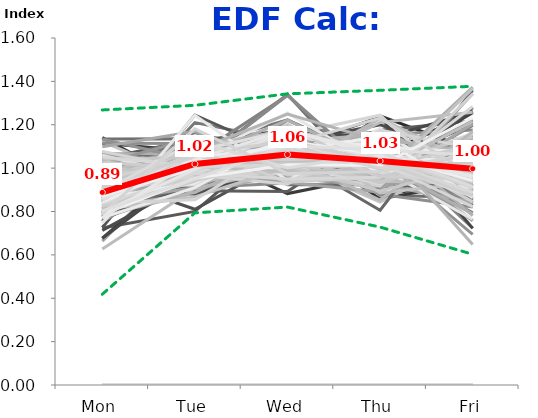
| Category | 12/31/90 | 1/7/91 | 1/14/91 | 1/21/91 | 1/28/91 | 2/4/91 | 2/11/91 | 2/18/91 | 2/25/91 | 3/4/91 | 3/11/91 | 3/18/91 | 3/25/91 | 4/1/91 | 4/8/91 | 4/15/91 | 4/22/91 | 4/29/91 | 5/6/91 | 5/13/91 | 5/20/91 | 5/27/91 | 6/3/91 | 6/10/91 | 6/17/91 | 6/24/91 | 7/1/91 | 7/8/91 | 7/15/91 | 7/22/91 | 7/29/91 | 8/5/91 | 8/12/91 | 8/19/91 | 8/26/91 | 9/2/91 | 9/9/91 | 9/16/91 | 9/23/91 | 9/30/91 | 10/7/91 | 10/14/91 | 10/21/91 | 10/28/91 | 11/4/91 | 11/11/91 | 11/18/91 | 11/25/91 | 12/2/91 | 12/9/91 | 12/16/91 | 12/23/91 | 12/30/91 | 1/6/92 | 1/13/92 | 1/20/92 | 1/27/92 | 2/3/92 | 2/10/92 | 2/17/92 | 2/24/92 | 3/2/92 | 3/9/92 | 3/16/92 | 3/23/92 | 3/30/92 | 4/6/92 | 4/13/92 | 4/20/92 | 4/27/92 | 5/4/92 | 5/11/92 | 5/18/92 | 5/25/92 | 6/1/92 | 6/8/92 | 6/15/92 | 6/22/92 | 6/29/92 | 7/6/92 | 7/13/92 | 7/20/92 | 7/27/92 | 8/3/92 | 8/10/92 | 8/17/92 | 8/24/92 | 8/31/92 | 9/7/92 | 9/14/92 | 9/21/92 | 9/28/92 | 10/5/92 | 10/12/92 | 10/19/92 | 10/26/92 | 11/2/92 | 11/9/92 | 11/16/92 | 11/23/92 | 11/30/92 | 12/7/92 | 12/14/92 | 12/21/92 | 12/28/92 | 1/4/93 | 1/11/93 | 1/18/93 | 1/25/93 | 2/1/93 | 2/8/93 | 2/15/93 | 2/22/93 | 3/1/93 | 3/8/93 | 3/15/93 | 3/22/93 | 3/29/93 | 4/5/93 | 4/12/93 | 4/19/93 | 4/26/93 | 5/3/93 | 5/10/93 | 5/17/93 | 5/24/93 | 5/31/93 | 6/7/93 | 6/14/93 | 6/21/93 | 6/28/93 | 7/5/93 | 7/12/93 | 7/19/93 | 7/26/93 | 8/2/93 | 8/9/93 | 8/16/93 | 8/23/93 | 8/30/93 | 9/6/93 | 9/13/93 | 9/20/93 | 9/27/93 | 10/4/93 | 10/11/93 | 10/18/93 | 10/25/93 | 11/1/93 | 11/8/93 | 11/15/93 | 11/22/93 | 11/29/93 | 12/6/93 | 12/13/93 | 12/20/93 | 12/27/93 | 1/3/94 | 1/10/94 | 1/17/94 | 1/24/94 | 1/31/94 | 2/7/94 | 2/14/94 | 2/21/94 | 2/28/94 | 3/7/94 | 3/14/94 | 3/21/94 | 3/28/94 | 4/4/94 | 4/11/94 | 4/18/94 | 4/25/94 | 5/2/94 | 5/9/94 | 5/16/94 | 5/23/94 | 5/30/94 | 6/6/94 | 6/13/94 | 6/20/94 | 6/27/94 | 7/4/94 | 7/11/94 | 7/18/94 | 7/25/94 | 8/1/94 | 8/8/94 | 8/15/94 | 8/22/94 | 8/29/94 | 9/5/94 | 9/12/94 | 9/19/94 | 9/26/94 | 10/3/94 | 10/10/94 | 10/17/94 | 10/24/94 | 10/31/94 | 11/7/94 | 11/14/94 | 11/21/94 | 11/28/94 | 12/5/94 | 12/12/94 | 12/19/94 | 12/26/94 | 1/2/95 | 1/9/95 | 1/16/95 | 1/23/95 | 1/30/95 | 2/6/95 | 2/13/95 | 2/20/95 | 2/27/95 | 3/6/95 | 3/13/95 | 3/20/95 | 3/27/95 | 4/3/95 | 4/10/95 | 4/17/95 | 4/24/95 | 5/1/95 | 5/8/95 | 5/15/95 | 5/22/95 | 5/29/95 | 6/5/95 | 6/12/95 | 6/19/95 | 6/26/95 | 7/3/95 | 7/10/95 | 7/17/95 | 7/24/95 | 7/31/95 | 8/7/95 | 8/14/95 | 8/21/95 | 8/28/95 | 9/4/95 | 9/11/95 | 9/18/95 | 9/25/95 | 10/2/95 | 10/9/95 | 10/16/95 | Min: | Max: | FINAL: |
|---|---|---|---|---|---|---|---|---|---|---|---|---|---|---|---|---|---|---|---|---|---|---|---|---|---|---|---|---|---|---|---|---|---|---|---|---|---|---|---|---|---|---|---|---|---|---|---|---|---|---|---|---|---|---|---|---|---|---|---|---|---|---|---|---|---|---|---|---|---|---|---|---|---|---|---|---|---|---|---|---|---|---|---|---|---|---|---|---|---|---|---|---|---|---|---|---|---|---|---|---|---|---|---|---|---|---|---|---|---|---|---|---|---|---|---|---|---|---|---|---|---|---|---|---|---|---|---|---|---|---|---|---|---|---|---|---|---|---|---|---|---|---|---|---|---|---|---|---|---|---|---|---|---|---|---|---|---|---|---|---|---|---|---|---|---|---|---|---|---|---|---|---|---|---|---|---|---|---|---|---|---|---|---|---|---|---|---|---|---|---|---|---|---|---|---|---|---|---|---|---|---|---|---|---|---|---|---|---|---|---|---|---|---|---|---|---|---|---|---|---|---|---|---|---|---|---|---|---|---|---|---|---|---|---|---|---|---|---|---|---|---|---|---|---|---|---|---|---|---|---|---|---|---|---|
| Mon | 0 | 0.914 | 0 | 0.757 | 0.724 | 0.966 | 1.115 | 0 | 0.957 | 0.895 | 0.82 | 0.91 | 0 | 0.771 | 0.789 | 0.778 | 1.001 | 0.849 | 0.81 | 0.753 | 0.726 | 0 | 0.992 | 0.828 | 0.83 | 0.852 | 0 | 0.869 | 0.869 | 1.005 | 0.839 | 0.812 | 0.792 | 1.141 | 0.877 | 0 | 0.784 | 0 | 0.907 | 0.913 | 0.9 | 0.663 | 0.874 | 0.858 | 0.88 | 0.677 | 1.134 | 0 | 1.017 | 0.901 | 0 | 0 | 0 | 0.948 | 0.713 | 0.839 | 0.909 | 0.8 | 0.873 | 0 | 0.848 | 0.906 | 0.885 | 0.792 | 0.886 | 0.753 | 0.842 | 0 | 0.903 | 0.891 | 0.958 | 0.842 | 0.87 | 0 | 0.938 | 0.849 | 0.768 | 0.95 | 0 | 0.945 | 0.781 | 0.948 | 0.797 | 0.939 | 0.842 | 0.85 | 0.95 | 0.939 | 0 | 1.122 | 0.811 | 0.878 | 0 | 0.676 | 1.002 | 0.941 | 0.987 | 0.912 | 0.829 | 0 | 0.974 | 1.007 | 0 | 0 | 0 | 0.77 | 0.828 | 0.777 | 1.042 | 0.779 | 1.006 | 0 | 1.115 | 0.926 | 1.04 | 0.792 | 0.956 | 0.792 | 0 | 0.952 | 0.862 | 1.067 | 0.903 | 0.935 | 0.81 | 0.82 | 0 | 0.975 | 0.858 | 0.899 | 0.92 | 0 | 0.793 | 0.869 | 0.878 | 0.989 | 0.93 | 0.848 | 0.859 | 0.843 | 0 | 0.866 | 0.855 | 0.928 | 0.878 | 0.628 | 1.075 | 0.933 | 0.818 | 0.827 | 0.843 | 0 | 0.988 | 1.025 | 0.849 | 0 | 0.848 | 0.822 | 1.052 | 0.774 | 0.938 | 0.965 | 1.133 | 0.88 | 0 | 0.873 | 0.912 | 0 | 0.902 | 0 | 1.098 | 0.887 | 0.83 | 0 | 1.06 | 0.93 | 0.79 | 1.019 | 0 | 1.06 | 0.839 | 0.883 | 0.982 | 0 | 0.826 | 0.876 | 0.88 | 0.953 | 0.843 | 0.79 | 0.816 | 0.94 | 0 | 0.799 | 0.887 | 0.913 | 0.909 | 0.746 | 0.815 | 0.874 | 0.997 | 0.926 | 0.823 | 0 | 0.931 | 0.838 | 0.808 | 0.898 | 0 | 0 | 0.86 | 0.939 | 1.002 | 0.845 | 1.028 | 0.771 | 0 | 0.879 | 0.878 | 0.802 | 0.902 | 0.862 | 0.934 | 0 | 0.915 | 0.956 | 0.839 | 0.838 | 0.906 | 0.854 | 0 | 1.041 | 0.831 | 0.872 | 0.904 | 0 | 1.077 | 0.822 | 0.9 | 0.871 | 0.948 | 0.796 | 1.052 | 0.911 | 0 | 0.787 | 0.892 | 0.772 | 0.888 | 0.788 | 0.803 | 0.418 | 1.268 | 0.888 |
| Tue | 0 | 1.008 | 0 | 0.978 | 0.8 | 1.119 | 1.078 | 0 | 0.81 | 1.126 | 0.896 | 0.986 | 0 | 1.017 | 0.967 | 1.035 | 1.024 | 1.164 | 0.968 | 1.21 | 1.245 | 0 | 1.028 | 1.047 | 0.964 | 0.97 | 0 | 0.947 | 0.98 | 1.082 | 1.055 | 1.116 | 1.16 | 0.913 | 0.972 | 0 | 0.975 | 0 | 1.088 | 1.009 | 1.072 | 1.091 | 1.102 | 1.023 | 0.973 | 1.042 | 1.136 | 0 | 1.01 | 0.993 | 0 | 0 | 0 | 0.955 | 0.947 | 1.016 | 1.033 | 1.013 | 0.928 | 0 | 0.984 | 1.035 | 1.118 | 0.96 | 1.085 | 1.027 | 0.96 | 0 | 1.009 | 0.973 | 1.101 | 1.031 | 1.087 | 0 | 1 | 1.005 | 0.91 | 1.07 | 0 | 1.144 | 1.027 | 0.993 | 1.055 | 0.952 | 1.029 | 0.955 | 1.164 | 1.014 | 0 | 0.945 | 0.989 | 0.943 | 0 | 0.998 | 1.149 | 1.003 | 1.01 | 1.03 | 0.886 | 0 | 1.081 | 1.075 | 0 | 0 | 0 | 0.924 | 0.91 | 1.102 | 1.134 | 0.887 | 0.994 | 0 | 1.113 | 1.079 | 1.087 | 0.884 | 0.954 | 0.909 | 0 | 1.047 | 1.12 | 1.066 | 1.076 | 0.88 | 0.942 | 0.923 | 0 | 0.988 | 0.928 | 1.048 | 1.05 | 0 | 0.928 | 1.115 | 1.007 | 1.052 | 1.021 | 0.949 | 1.098 | 1.1 | 0 | 0.912 | 1.115 | 0.921 | 1.125 | 0.906 | 0.991 | 1.019 | 0.974 | 0.983 | 1.019 | 0 | 1.05 | 1.003 | 0.91 | 0 | 1.007 | 0.962 | 1.006 | 1.024 | 1.027 | 0.965 | 1.036 | 1.025 | 0 | 0.994 | 0.951 | 0 | 1.034 | 0 | 1.17 | 0.94 | 0.99 | 0 | 1.029 | 1.096 | 1.049 | 1.142 | 0 | 0.952 | 0.995 | 1.152 | 1.049 | 0 | 0.936 | 0.967 | 0.953 | 1.084 | 1.012 | 1.076 | 1.064 | 1.041 | 0 | 0.966 | 1.044 | 0.971 | 1.097 | 1.244 | 0.887 | 0.991 | 1.037 | 1.044 | 1.073 | 0 | 1.007 | 0.969 | 0.867 | 1.08 | 0 | 0 | 1.083 | 0.991 | 0.968 | 1.086 | 0.996 | 0.91 | 0 | 0.976 | 1.041 | 1.008 | 1.098 | 0.931 | 1.048 | 0 | 0.943 | 1.032 | 0.855 | 1.05 | 1.053 | 1.078 | 0 | 1.049 | 0.976 | 1.038 | 1.066 | 0 | 0.991 | 0.939 | 1.065 | 1 | 1.05 | 0.994 | 1.008 | 1.062 | 0 | 0.953 | 1.008 | 1.04 | 1.125 | 1.181 | 0.95 | 0.794 | 1.29 | 1.019 |
| Wed | 0 | 1.34 | 0 | 0.942 | 1.164 | 1.068 | 0.883 | 0 | 1.045 | 1.173 | 0.892 | 1.093 | 0 | 1.145 | 0.996 | 1.192 | 1.018 | 1.032 | 0.994 | 1.125 | 1.055 | 0 | 1.063 | 1.076 | 0.988 | 1.158 | 0 | 1.112 | 1.044 | 1.073 | 1.041 | 1.101 | 1.066 | 1.153 | 1.154 | 0 | 1.008 | 0 | 0.977 | 1.015 | 1.131 | 1.149 | 1.062 | 1.063 | 0.945 | 0.97 | 0.923 | 0 | 1.014 | 1.07 | 0 | 0 | 0 | 1.099 | 1.115 | 1.06 | 1.186 | 1.137 | 1.104 | 0 | 1.129 | 1.048 | 1.026 | 0.988 | 1.09 | 1.043 | 1.171 | 0 | 1.03 | 1.064 | 1.094 | 0.939 | 1.14 | 0 | 1.063 | 1.11 | 1.138 | 1.088 | 0 | 1.017 | 1.094 | 1.097 | 1.335 | 0.984 | 1.043 | 1.038 | 0.986 | 1.089 | 0 | 1.032 | 1.082 | 1.019 | 0 | 0.934 | 0.98 | 1.016 | 0.943 | 1.125 | 1.034 | 0 | 1.009 | 1.056 | 0 | 0 | 0 | 1.13 | 0.932 | 1.023 | 1.002 | 1.128 | 1.041 | 0 | 1.072 | 1.085 | 0.956 | 0.975 | 1.128 | 1.098 | 0 | 0.94 | 1.012 | 0.999 | 1.1 | 1.015 | 1.221 | 1.154 | 0 | 1.02 | 1.063 | 1.123 | 1.081 | 0 | 1.164 | 1.12 | 1.071 | 0.957 | 1.074 | 1.135 | 1.222 | 1.074 | 0 | 1.056 | 1.078 | 1.052 | 1.093 | 0.999 | 1.002 | 1.002 | 1.095 | 1.008 | 1.071 | 0 | 1.065 | 1.1 | 1.097 | 0 | 1.336 | 1.178 | 1.023 | 1.03 | 0.96 | 0.984 | 1.083 | 0.988 | 0 | 1.176 | 0.989 | 0 | 1.04 | 0 | 0.964 | 1.018 | 1.12 | 0 | 0.956 | 1.027 | 1.137 | 1.037 | 0 | 1.049 | 0.933 | 0.969 | 1.038 | 0 | 0.986 | 1.031 | 1.038 | 1.038 | 1.093 | 1.106 | 1.076 | 1.254 | 0 | 0.975 | 1.138 | 1.104 | 1.176 | 0.943 | 1.09 | 0.98 | 1.097 | 1.221 | 0.938 | 0 | 1.055 | 0.925 | 1.005 | 1.249 | 0 | 0 | 1.06 | 1.017 | 1.05 | 1.048 | 1.011 | 1.147 | 0 | 1.113 | 1.024 | 0.983 | 0.935 | 1.123 | 1.006 | 0 | 1.033 | 1.033 | 1.11 | 1.1 | 1.005 | 1.175 | 0 | 1.009 | 0.95 | 1.081 | 1.121 | 0 | 1.087 | 1.204 | 1.137 | 1.125 | 1.04 | 1.174 | 1.014 | 1.126 | 0 | 1.016 | 1.094 | 1.177 | 1.001 | 0.975 | 1.103 | 0.82 | 1.343 | 1.063 |
| Thu | 0 | 0.876 | 0 | 1.241 | 1.05 | 1.123 | 0.968 | 0 | 1.1 | 0.881 | 1.175 | 1.113 | 0 | 1.062 | 1.118 | 1.049 | 1.018 | 1.057 | 1.137 | 0.899 | 1.147 | 0 | 0.959 | 0.952 | 1.013 | 1.007 | 0 | 0.985 | 1.077 | 0.981 | 1.058 | 1.049 | 0.95 | 0.858 | 1.034 | 0 | 1.091 | 0 | 1.01 | 1.063 | 0.995 | 1.05 | 1.015 | 0.964 | 1.167 | 1.052 | 0.923 | 0 | 0.894 | 0.996 | 0 | 0 | 0 | 1.105 | 1.2 | 1.09 | 0.929 | 1.049 | 1.07 | 0 | 1.006 | 1.048 | 0.992 | 1.004 | 0.999 | 1.042 | 1.091 | 0 | 1.12 | 1.155 | 0.925 | 1.071 | 1.061 | 0 | 1.007 | 1.078 | 1.056 | 1.024 | 0 | 1.059 | 1.088 | 1.026 | 0.937 | 1.037 | 1.098 | 1.019 | 1.026 | 1.235 | 0 | 0.844 | 0.991 | 1.124 | 0 | 1.134 | 0.974 | 1.027 | 1.067 | 1.043 | 1.035 | 0 | 0.975 | 1.106 | 0 | 0 | 0 | 1.167 | 1.154 | 0.982 | 0.929 | 1.146 | 1.062 | 0 | 0.879 | 0.917 | 0.961 | 0.975 | 1.032 | 0.922 | 0 | 0.948 | 1.092 | 0.938 | 1.025 | 1.167 | 1.031 | 1.244 | 0 | 0.957 | 0.954 | 1.08 | 1.11 | 0 | 1.086 | 1.003 | 1.046 | 1.085 | 1.115 | 1.065 | 1.027 | 1.126 | 0 | 0.806 | 1.026 | 1.113 | 0.974 | 1.211 | 0.945 | 1.079 | 1.035 | 1.022 | 1.052 | 0 | 0.925 | 1.01 | 0.941 | 0 | 0.96 | 1.083 | 0.915 | 1.026 | 1.091 | 0.953 | 1.054 | 1.138 | 0 | 0.942 | 1.18 | 0 | 1.111 | 0 | 0.924 | 1.027 | 1.157 | 0 | 0.913 | 1.011 | 1.035 | 1.044 | 0 | 1.031 | 0.89 | 0.989 | 1.149 | 0 | 1.229 | 1.118 | 1.016 | 1.081 | 1.074 | 1.039 | 0.985 | 1 | 0 | 0.918 | 0.97 | 1.021 | 0.886 | 1.182 | 1.132 | 0.996 | 0.939 | 1.019 | 1.02 | 0 | 1.012 | 1.176 | 0.951 | 1.124 | 0 | 0 | 0.961 | 0.928 | 0.933 | 0.853 | 1.028 | 1.097 | 0 | 1.015 | 0.937 | 0.991 | 0.961 | 1.056 | 1.014 | 0 | 1 | 1.032 | 1.231 | 0.981 | 1.01 | 1.024 | 0 | 0.895 | 0.958 | 1.145 | 0.961 | 0 | 1.022 | 0.96 | 1.011 | 1.063 | 1.052 | 1.073 | 1.038 | 1.029 | 0 | 1.012 | 1.001 | 1.052 | 1.071 | 0.984 | 1.085 | 0.728 | 1.359 | 1.033 |
| Fri | 0 | 0.863 | 0 | 1.082 | 1.262 | 0.723 | 0.956 | 0 | 1.087 | 0.925 | 1.218 | 0.898 | 0 | 1.004 | 1.129 | 0.946 | 0.939 | 0.899 | 1.091 | 1.013 | 0.827 | 0 | 0.957 | 1.097 | 1.205 | 1.012 | 0 | 1.088 | 1.029 | 0.859 | 1.008 | 0.922 | 1.033 | 0.935 | 0.964 | 0 | 1.143 | 0 | 1.018 | 0.999 | 0.902 | 1.047 | 0.947 | 1.092 | 1.035 | 1.259 | 0.885 | 0 | 1.065 | 1.04 | 0 | 0 | 0 | 0.893 | 1.024 | 0.995 | 0.942 | 1.001 | 1.026 | 0 | 1.034 | 0.964 | 0.98 | 1.256 | 0.939 | 1.135 | 0.936 | 0 | 0.938 | 0.917 | 0.921 | 1.117 | 0.842 | 0 | 0.991 | 0.958 | 1.128 | 0.866 | 0 | 0.834 | 1.009 | 0.937 | 0.875 | 1.087 | 0.987 | 1.138 | 0.874 | 0.722 | 0 | 1.058 | 1.127 | 1.036 | 0 | 1.258 | 0.895 | 1.013 | 0.994 | 0.89 | 1.217 | 0 | 0.962 | 0.757 | 0 | 0 | 0 | 1.009 | 1.176 | 1.116 | 0.894 | 1.06 | 0.896 | 0 | 0.821 | 0.994 | 0.956 | 1.374 | 0.93 | 1.28 | 0 | 1.112 | 0.914 | 0.93 | 0.896 | 1.002 | 0.995 | 0.859 | 0 | 1.06 | 1.196 | 0.85 | 0.839 | 0 | 1.029 | 0.893 | 0.998 | 0.917 | 0.861 | 1.003 | 0.794 | 0.857 | 0 | 1.36 | 0.926 | 0.986 | 0.931 | 1.257 | 0.987 | 0.968 | 1.078 | 1.159 | 1.015 | 0 | 0.972 | 0.862 | 1.204 | 0 | 0.849 | 0.955 | 1.004 | 1.146 | 0.984 | 1.133 | 0.695 | 0.969 | 0 | 1.016 | 0.968 | 0 | 0.913 | 0 | 0.843 | 1.128 | 0.903 | 0 | 1.041 | 0.936 | 0.989 | 0.758 | 0 | 0.908 | 1.343 | 1.007 | 0.781 | 0 | 1.023 | 1.008 | 1.114 | 0.845 | 0.978 | 0.989 | 1.058 | 0.764 | 0 | 1.342 | 0.961 | 0.991 | 0.932 | 0.884 | 1.076 | 1.159 | 0.93 | 0.789 | 1.145 | 0 | 0.995 | 1.092 | 1.368 | 0.648 | 0 | 0 | 1.036 | 1.124 | 1.047 | 1.168 | 0.937 | 1.074 | 0 | 1.017 | 1.121 | 1.216 | 1.104 | 1.028 | 0.997 | 0 | 1.11 | 0.946 | 0.967 | 1.031 | 1.026 | 0.869 | 0 | 1.007 | 1.284 | 0.864 | 0.948 | 0 | 0.823 | 1.075 | 0.887 | 0.942 | 0.91 | 0.964 | 0.889 | 0.872 | 0 | 1.232 | 1.004 | 0.959 | 0.915 | 1.071 | 1.059 | 0.603 | 1.377 | 0.997 |